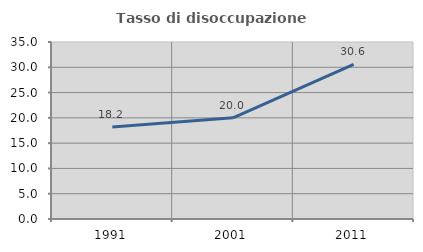
| Category | Tasso di disoccupazione giovanile  |
|---|---|
| 1991.0 | 18.182 |
| 2001.0 | 20 |
| 2011.0 | 30.556 |